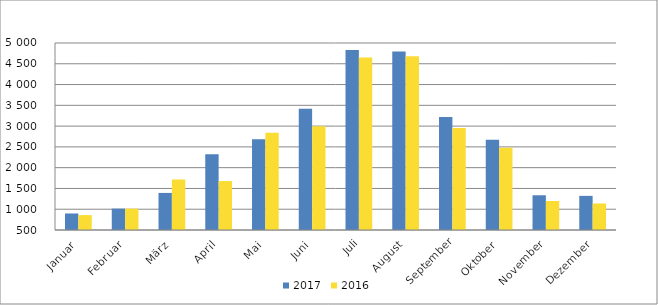
| Category | 2017 | 2016 |
|---|---|---|
| Januar | 897577 | 858715 |
| Februar | 1014518 | 1013616 |
| März | 1392254 | 1715851 |
| April | 2320500 | 1677583 |
| Mai | 2682742 | 2842846 |
| Juni | 3416039 | 2996312 |
| Juli | 4828562 | 4648328 |
| August | 4795629 | 4681741 |
| September | 3217574 | 2955384 |
| Oktober | 2669133 | 2477889 |
| November | 1335705 | 1198475 |
| Dezember | 1321626 | 1137684 |